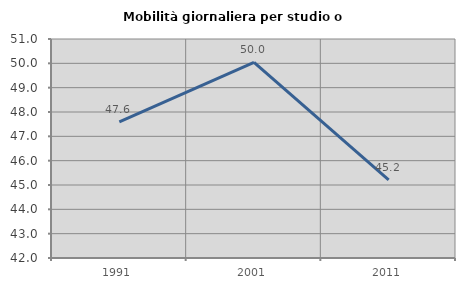
| Category | Mobilità giornaliera per studio o lavoro |
|---|---|
| 1991.0 | 47.598 |
| 2001.0 | 50.036 |
| 2011.0 | 45.207 |